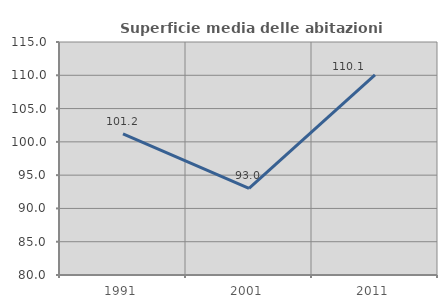
| Category | Superficie media delle abitazioni occupate |
|---|---|
| 1991.0 | 101.202 |
| 2001.0 | 93.029 |
| 2011.0 | 110.053 |